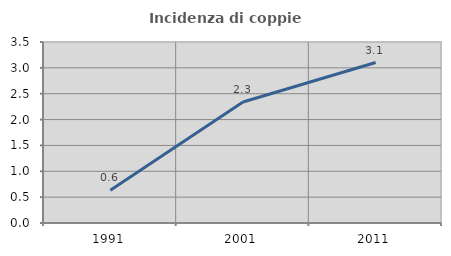
| Category | Incidenza di coppie miste |
|---|---|
| 1991.0 | 0.634 |
| 2001.0 | 2.339 |
| 2011.0 | 3.103 |